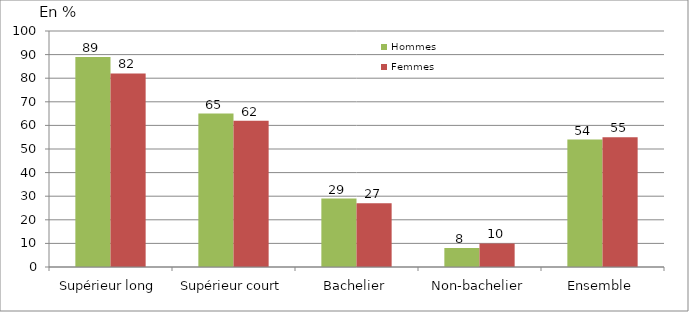
| Category | Hommes | Femmes |
|---|---|---|
| Supérieur long | 89 | 82 |
| Supérieur court | 65 | 62 |
| Bachelier | 29 | 27 |
| Non-bachelier | 8 | 10 |
| Ensemble | 54 | 55 |